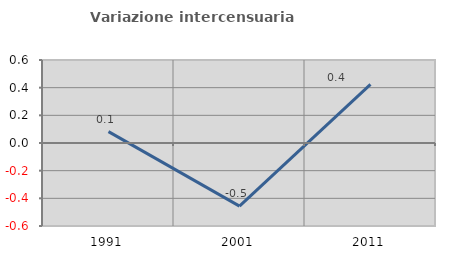
| Category | Variazione intercensuaria annua |
|---|---|
| 1991.0 | 0.082 |
| 2001.0 | -0.456 |
| 2011.0 | 0.424 |